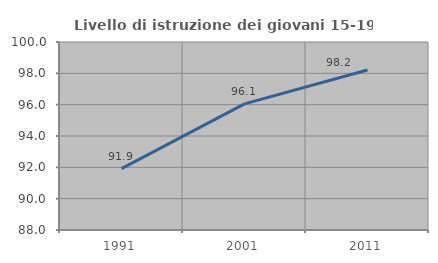
| Category | Livello di istruzione dei giovani 15-19 anni |
|---|---|
| 1991.0 | 91.919 |
| 2001.0 | 96.053 |
| 2011.0 | 98.214 |